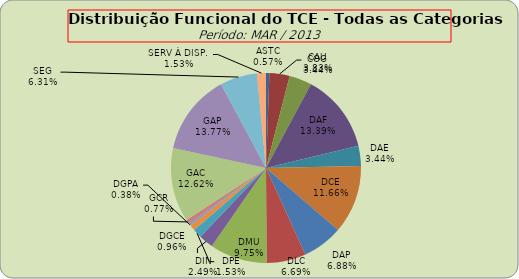
| Category | ASTC COG CAU DAF DAE DCE DAP DLC DMU DIN DPE DGCE DGPA GCR GAC GAP SEG SERV À DISP. |
|---|---|
| ASTC | 3 |
| COG | 18 |
| CAU | 20 |
| DAF | 70 |
| DAE | 18 |
| DCE | 61 |
| DAP | 36 |
| DLC | 35 |
| DMU | 51 |
| DIN | 13 |
| DPE | 8 |
| DGCE | 5 |
| DGPA | 2 |
| GCR | 4 |
| GAC | 66 |
| GAP | 72 |
| SEG | 33 |
| SERV À DISP. | 8 |